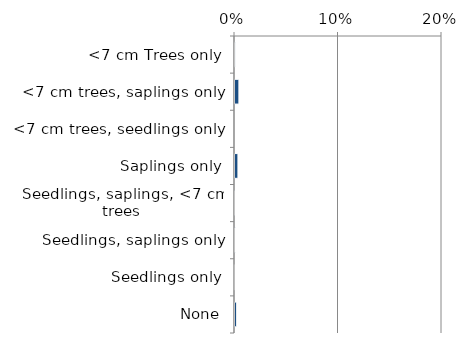
| Category | Near native & fragments |
|---|---|
| None | 0.003 |
| Seedlings only | 0 |
| Seedlings, saplings only | 0.001 |
| Seedlings, saplings, <7 cm trees | 0.001 |
| Saplings only | 0.004 |
| <7 cm trees, seedlings only | 0 |
| <7 cm trees, saplings only | 0.005 |
| <7 cm Trees only | 0.001 |